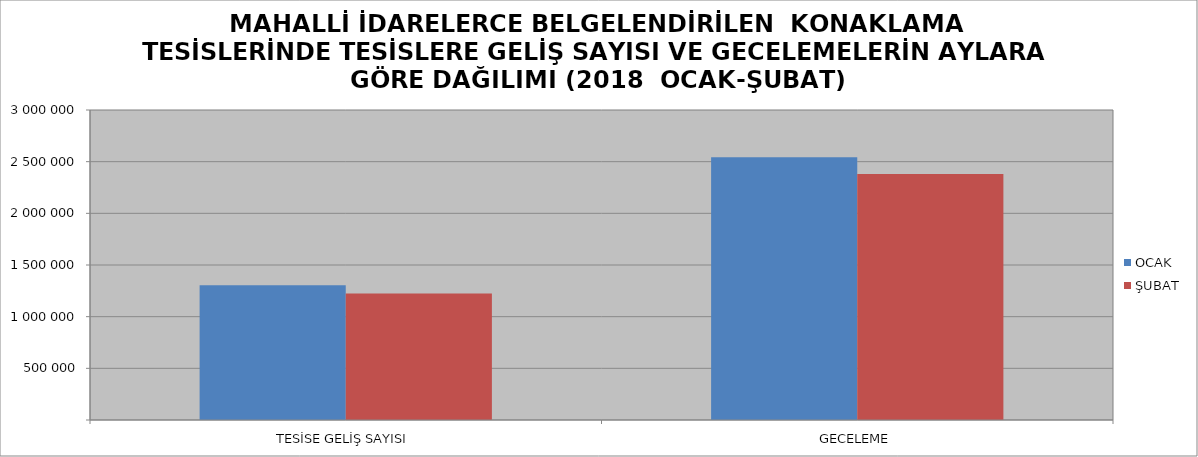
| Category | OCAK | ŞUBAT |
|---|---|---|
| TESİSE GELİŞ SAYISI | 1303353 | 1223475 |
| GECELEME | 2542103 | 2381300 |